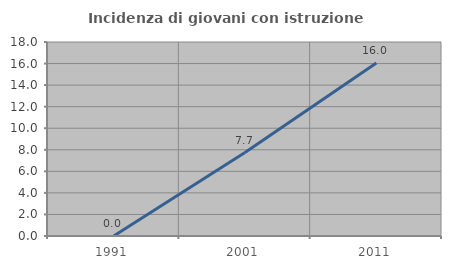
| Category | Incidenza di giovani con istruzione universitaria |
|---|---|
| 1991.0 | 0 |
| 2001.0 | 7.742 |
| 2011.0 | 16.043 |